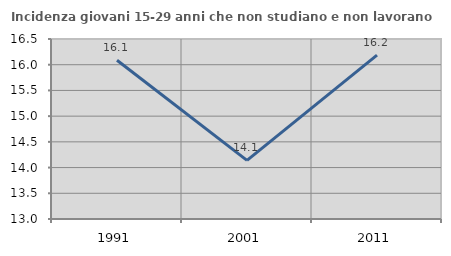
| Category | Incidenza giovani 15-29 anni che non studiano e non lavorano  |
|---|---|
| 1991.0 | 16.086 |
| 2001.0 | 14.141 |
| 2011.0 | 16.187 |